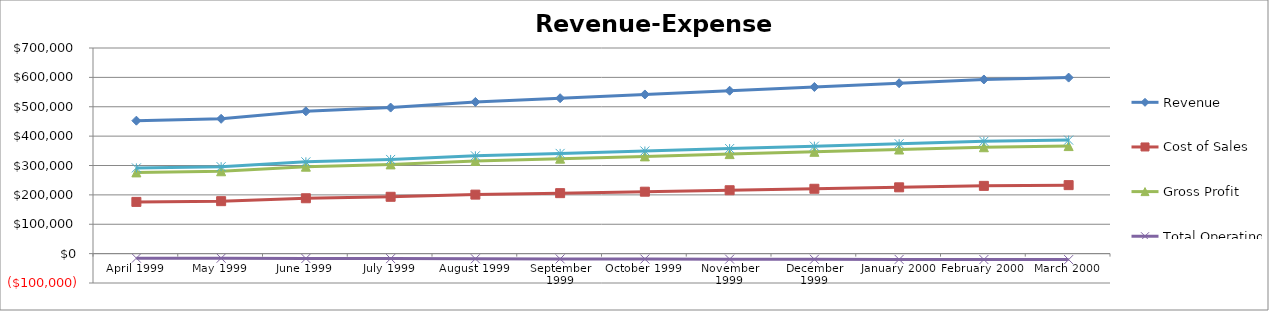
| Category | Revenue | Cost of Sales | Gross Profit | Total Operating Expense | Net Income before Taxes |
|---|---|---|---|---|---|
| April 1999 | 452596.78 | 176099.71 | 276497.07 | -15359.82 | 291856.89 |
| May 1999 | 458971.42 | 178580.04 | 280391.38 | -15576.12 | 295967.5 |
| June 1999 | 484469.83 | 188501.12 | 295968.71 | -16441.51 | 312410.22 |
| July 1999 | 497219.06 | 193461.66 | 303757.4 | -16874.1 | 320631.5 |
| August 1999 | 516342.79 | 200902.5 | 315440.29 | -17523.17 | 332963.46 |
| September 1999 | 529092.04 | 205863.11 | 323228.93 | -17955.82 | 341184.75 |
| October 1999 | 541841.26 | 210823.62 | 331017.64 | -18388.47 | 349406.11 |
| November 1999 | 554590.43 | 215784.16 | 338806.27 | -18821.15 | 357627.42 |
| December 1999 | 567339.73 | 220744.75 | 346594.98 | -19253.72 | 365848.7 |
| January 2000 | 580088.84 | 225705.28 | 354383.56 | -19686.56 | 374070.12 |
| February 2000 | 592838.1 | 230665.88 | 362172.22 | -20119.18 | 382291.4 |
| March 2000 | 599212.71 | 233146.14 | 366066.57 | -20335.41 | 386401.98 |